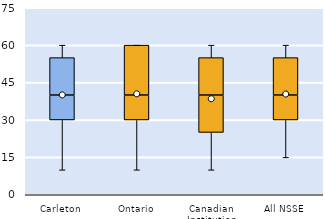
| Category | 25th | 50th | 75th |
|---|---|---|---|
| Carleton | 30 | 10 | 15 |
| Ontario | 30 | 10 | 20 |
| Canadian Institution | 25 | 15 | 15 |
| All NSSE | 30 | 10 | 15 |